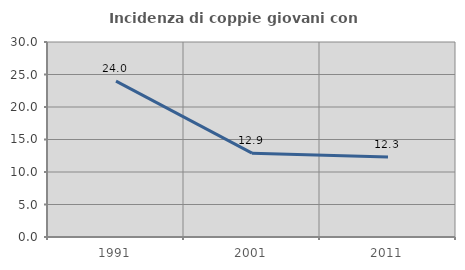
| Category | Incidenza di coppie giovani con figli |
|---|---|
| 1991.0 | 23.99 |
| 2001.0 | 12.903 |
| 2011.0 | 12.32 |